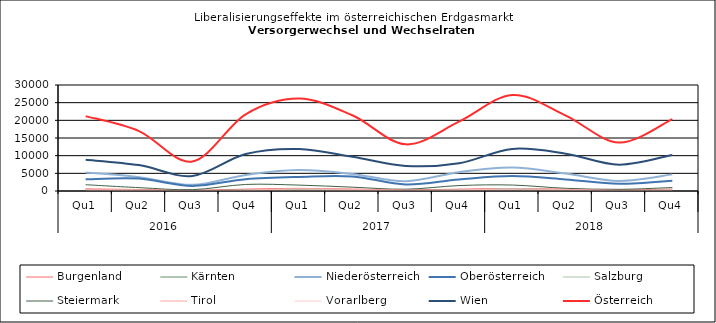
| Category | Burgenland | Kärnten | Niederösterreich | Oberösterreich | Salzburg | Steiermark | Tirol | Vorarlberg | Wien | Österreich |
|---|---|---|---|---|---|---|---|---|---|---|
| 0 | 607 | 284 | 5224 | 3318 | 462 | 1781 | 522 | 162 | 8838 | 21198 |
| 1 | 419 | 203 | 3914 | 3508 | 207 | 955 | 302 | 124 | 7332 | 16964 |
| 2 | 207 | 78 | 1748 | 1443 | 101 | 376 | 115 | 50 | 4249 | 8367 |
| 3 | 528 | 328 | 4540 | 3342 | 219 | 1856 | 201 | 226 | 10477 | 21717 |
| 4 | 756 | 379 | 5939 | 3993 | 630 | 1668 | 666 | 231 | 11887 | 26149 |
| 5 | 548 | 247 | 4814 | 4125 | 255 | 1084 | 457 | 221 | 9679 | 21430 |
| 6 | 328 | 168 | 2760 | 1868 | 120 | 500 | 274 | 84 | 7105 | 13207 |
| 7 | 523 | 399 | 5331 | 3275 | 178 | 1538 | 275 | 254 | 7859 | 19632 |
| 8 | 700 | 464 | 6640 | 4221 | 704 | 1686 | 558 | 285 | 11914 | 27172 |
| 9 | 527 | 264 | 4955 | 3288 | 323 | 762 | 461 | 192 | 10574 | 21346 |
| 10 | 306 | 172 | 2850 | 2045 | 131 | 474 | 182 | 111 | 7445 | 13716 |
| 11 | 561 | 260 | 4704 | 2928 | 194 | 980 | 263 | 257 | 10208 | 20355 |